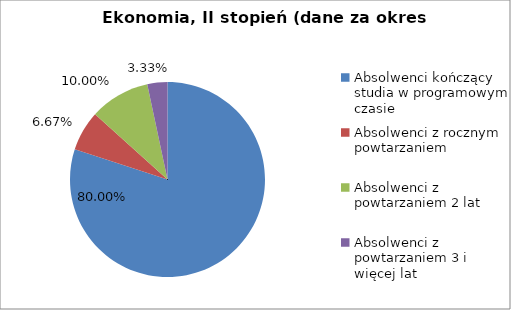
| Category | Series 0 |
|---|---|
| Absolwenci kończący studia w programowym czasie | 80 |
| Absolwenci z rocznym powtarzaniem | 6.667 |
| Absolwenci z powtarzaniem 2 lat | 10 |
| Absolwenci z powtarzaniem 3 i więcej lat | 3.333 |